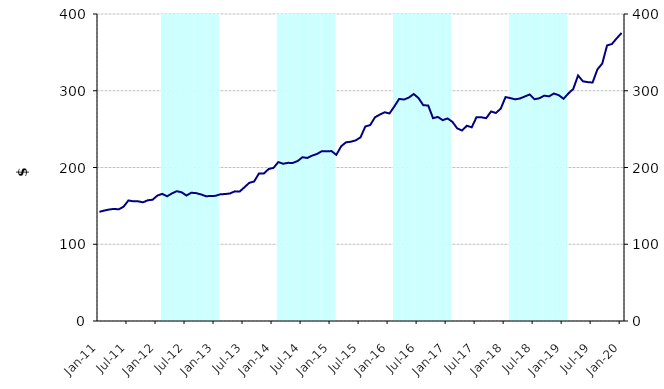
| Category | Series 1 |
|---|---|
| 0 | 0 |
| 1900-01-01 | 0 |
| 1900-01-02 | 0 |
| 1900-01-03 | 0 |
| 1900-01-04 | 0 |
| 1900-01-05 | 0 |
| 1900-01-06 | 0 |
| 1900-01-07 | 0 |
| 1900-01-08 | 0 |
| 1900-01-09 | 0 |
| 1900-01-10 | 0 |
| 1900-01-11 | 0 |
| 1900-01-12 | 0 |
| 1900-01-13 | 400000000 |
| 1900-01-14 | 400000000 |
| 1900-01-15 | 400000000 |
| 1900-01-16 | 400000000 |
| 1900-01-17 | 400000000 |
| 1900-01-18 | 400000000 |
| 1900-01-19 | 400000000 |
| 1900-01-20 | 400000000 |
| 1900-01-21 | 400000000 |
| 1900-01-22 | 400000000 |
| 1900-01-23 | 400000000 |
| 1900-01-24 | 400000000 |
| 1900-01-25 | 0 |
| 1900-01-26 | 0 |
| 1900-01-27 | 0 |
| 1900-01-28 | 0 |
| 1900-01-29 | 0 |
| 1900-01-30 | 0 |
| 1900-01-31 | 0 |
| 1900-02-01 | 0 |
| 1900-02-02 | 0 |
| 1900-02-03 | 0 |
| 1900-02-04 | 0 |
| 1900-02-05 | 0 |
| 1900-02-06 | 400000000 |
| 1900-02-07 | 400000000 |
| 1900-02-08 | 400000000 |
| 1900-02-09 | 400000000 |
| 1900-02-10 | 400000000 |
| 1900-02-11 | 400000000 |
| 1900-02-12 | 400000000 |
| 1900-02-13 | 400000000 |
| 1900-02-14 | 400000000 |
| 1900-02-15 | 400000000 |
| 1900-02-16 | 400000000 |
| 1900-02-17 | 400000000 |
| 1900-02-18 | 0 |
| 1900-02-19 | 0 |
| 1900-02-20 | 0 |
| 1900-02-21 | 0 |
| 1900-02-22 | 0 |
| 1900-02-23 | 0 |
| 1900-02-24 | 0 |
| 1900-02-25 | 0 |
| 1900-02-26 | 0 |
| 1900-02-27 | 0 |
| 1900-02-28 | 0 |
| 1900-02-28 | 0 |
| 1900-03-01 | 400000000 |
| 1900-03-02 | 400000000 |
| 1900-03-03 | 400000000 |
| 1900-03-04 | 400000000 |
| 1900-03-05 | 400000000 |
| 1900-03-06 | 400000000 |
| 1900-03-07 | 400000000 |
| 1900-03-08 | 400000000 |
| 1900-03-09 | 400000000 |
| 1900-03-10 | 400000000 |
| 1900-03-11 | 400000000 |
| 1900-03-12 | 400000000 |
| 1900-03-13 | 0 |
| 1900-03-14 | 0 |
| 1900-03-15 | 0 |
| 1900-03-16 | 0 |
| 1900-03-17 | 0 |
| 1900-03-18 | 0 |
| 1900-03-19 | 0 |
| 1900-03-20 | 0 |
| 1900-03-21 | 0 |
| 1900-03-22 | 0 |
| 1900-03-23 | 0 |
| 1900-03-24 | 0 |
| 1900-03-25 | 400000000 |
| 1900-03-26 | 400000000 |
| 1900-03-27 | 400000000 |
| 1900-03-28 | 400000000 |
| 1900-03-29 | 400000000 |
| 1900-03-30 | 400000000 |
| 1900-03-31 | 400000000 |
| 1900-04-01 | 400000000 |
| 1900-04-02 | 400000000 |
| 1900-04-03 | 400000000 |
| 1900-04-04 | 400000000 |
| 1900-04-05 | 400000000 |
| 1900-04-06 | 0 |
| 1900-04-07 | 0 |
| 1900-04-08 | 0 |
| 1900-04-09 | 0 |
| 1900-04-10 | 0 |
| 1900-04-11 | 0 |
| 1900-04-12 | 0 |
| 1900-04-13 | 0 |
| 1900-04-14 | 0 |
| 1900-04-15 | 0 |
| 1900-04-16 | 0 |
| 1900-04-17 | 0 |